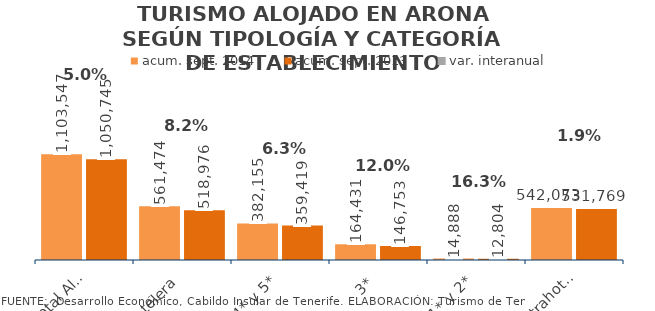
| Category | acum. sept. 2014 | acum. sept. 2013 |
|---|---|---|
| Total Alojados | 1103547 | 1050745 |
| Hotelera | 561474 | 518976 |
| 4* y 5* | 382155 | 359419 |
| 3* | 164431 | 146753 |
| 1* y 2* | 14888 | 12804 |
| Extrahotelera | 542073 | 531769 |